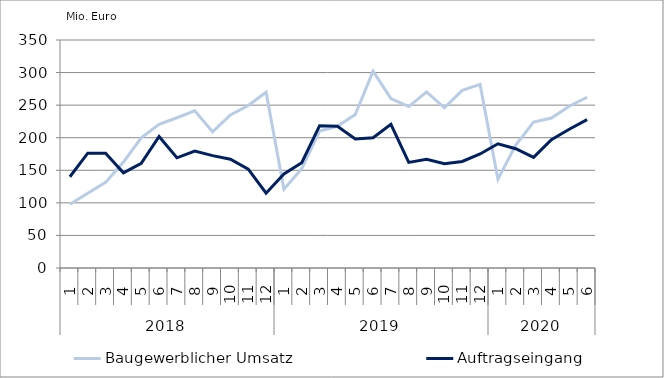
| Category | Baugewerblicher Umsatz | Auftragseingang |
|---|---|---|
| 0 | 97959.056 | 140119.385 |
| 1 | 114756.787 | 176330.213 |
| 2 | 131454.642 | 176241.061 |
| 3 | 162648.053 | 146063.407 |
| 4 | 199809.407 | 160551.931 |
| 5 | 220535.974 | 201835.846 |
| 6 | 230672.472 | 169132.23 |
| 7 | 241233.619 | 179396.293 |
| 8 | 209099.292 | 172542.764 |
| 9 | 234953.007 | 166991.729 |
| 10 | 249410.043 | 151835.629 |
| 11 | 269773.227 | 114807.456 |
| 12 | 120975.133 | 144510.881 |
| 13 | 152329.786 | 161685.201 |
| 14 | 210227.67 | 218455.879 |
| 15 | 217522.321 | 217610.064 |
| 16 | 235490.429 | 198110.439 |
| 17 | 301963.302 | 200012.086 |
| 18 | 259975.317 | 220559.061 |
| 19 | 247779.658 | 162059.723 |
| 20 | 270249.609 | 166829.611 |
| 21 | 245966.91 | 160120.773 |
| 22 | 272620.351 | 163589.389 |
| 23 | 281810.121 | 175051.247 |
| 24 | 136135.432 | 190647.086 |
| 25 | 188682.361 | 183141.14 |
| 26 | 224009.315 | 169770.009 |
| 27 | 230172.252 | 196979.845 |
| 28 | 248410.714 | 212955.83 |
| 29 | 262078.128 | 227853.487 |